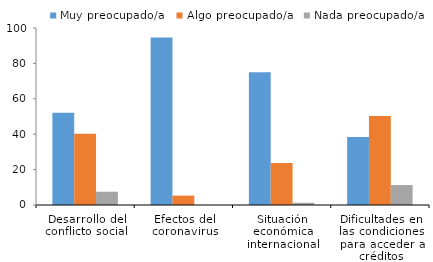
| Category | Muy preocupado/a | Algo preocupado/a | Nada preocupado/a |
|---|---|---|---|
| 0 | 52.188 | 40.312 | 7.5 |
| 1 | 94.688 | 5.312 | 0 |
| 2 | 75 | 23.75 | 1.25 |
| 3 | 38.438 | 50.313 | 11.25 |